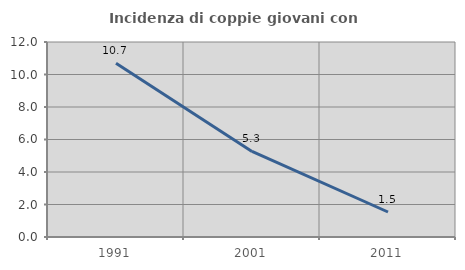
| Category | Incidenza di coppie giovani con figli |
|---|---|
| 1991.0 | 10.692 |
| 2001.0 | 5.263 |
| 2011.0 | 1.538 |